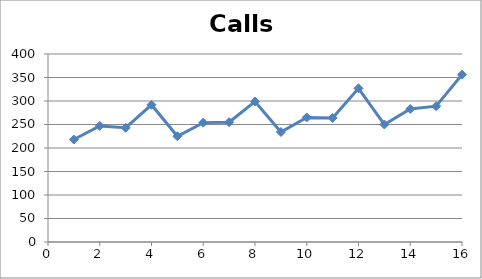
| Category | Calls |
|---|---|
| 1.0 | 218 |
| 2.0 | 247 |
| 3.0 | 243 |
| 4.0 | 292 |
| 5.0 | 225 |
| 6.0 | 254 |
| 7.0 | 255 |
| 8.0 | 299 |
| 9.0 | 234 |
| 10.0 | 265 |
| 11.0 | 264 |
| 12.0 | 327 |
| 13.0 | 250 |
| 14.0 | 283 |
| 15.0 | 289 |
| 16.0 | 356 |